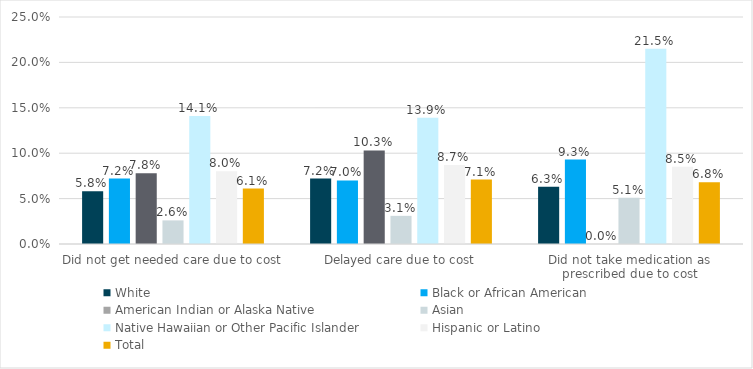
| Category | White | Black or African American | American Indian or Alaska Native | Asian | Native Hawaiian or Other Pacific Islander | Hispanic or Latino | Total |
|---|---|---|---|---|---|---|---|
| Did not get needed care due to cost | 0.058 | 0.072 | 0.078 | 0.026 | 0.141 | 0.08 | 0.061 |
| Delayed care due to cost | 0.072 | 0.07 | 0.103 | 0.031 | 0.139 | 0.087 | 0.071 |
| Did not take medication as prescribed due to cost | 0.063 | 0.093 | 0 | 0.051 | 0.215 | 0.085 | 0.068 |